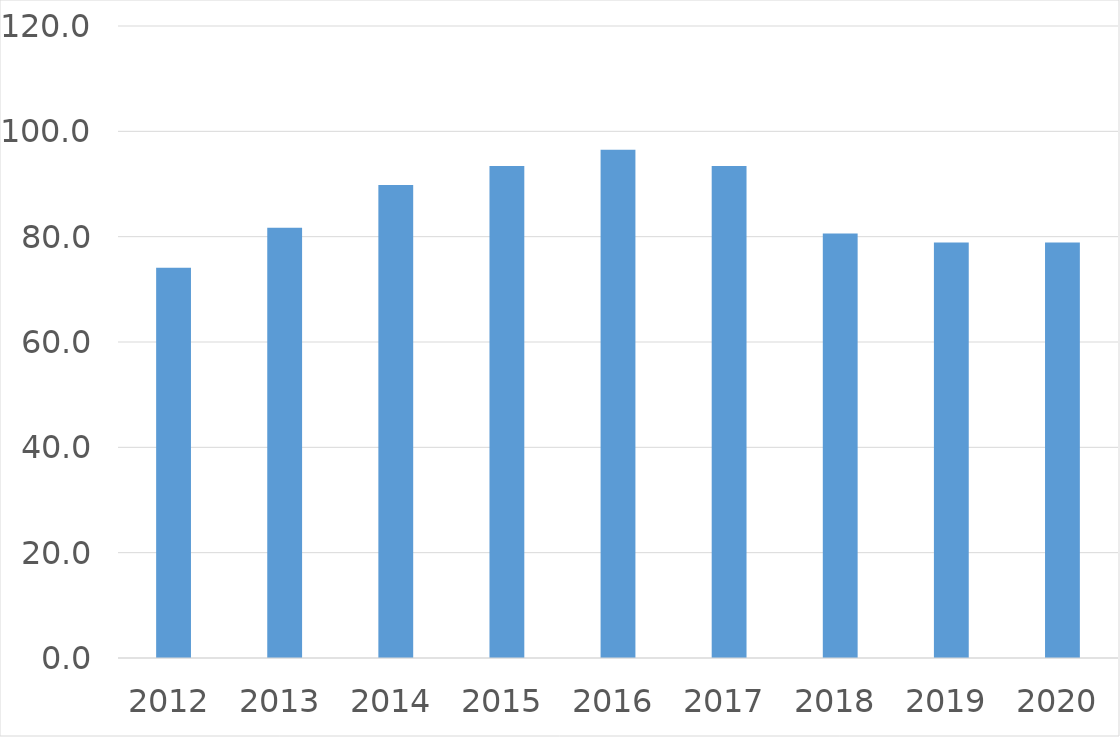
| Category | Series 0 |
|---|---|
| 2012 | 74.1 |
| 2013 | 81.7 |
| 2014 | 89.8 |
| 2015 | 93.4 |
| 2016 | 96.5 |
| 2017 | 93.4 |
| 2018 | 80.6 |
| 2019 | 78.9 |
| 2020 | 78.9 |